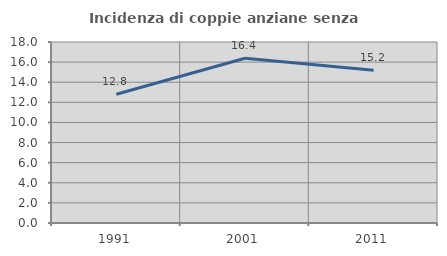
| Category | Incidenza di coppie anziane senza figli  |
|---|---|
| 1991.0 | 12.806 |
| 2001.0 | 16.384 |
| 2011.0 | 15.196 |